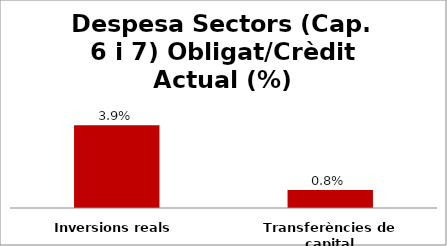
| Category | Series 0 |
|---|---|
| Inversions reals | 0.039 |
| Transferències de capital | 0.008 |